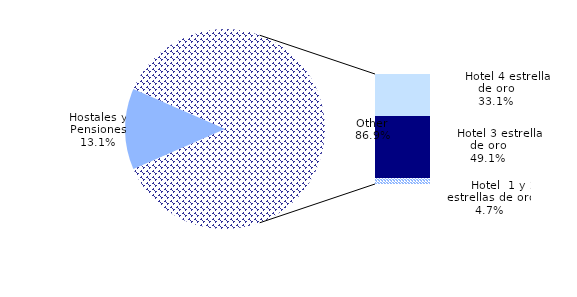
| Category | Pernoctaciones |
|---|---|
| Hostales y Pensiones | 132042.697 |
|       Hotel 4 estrellas de oro | 333764 |
|       Hotel 3 estrellas de oro | 494636 |
|       Hotel  1 y 2 estrellas de oro | 47362.847 |